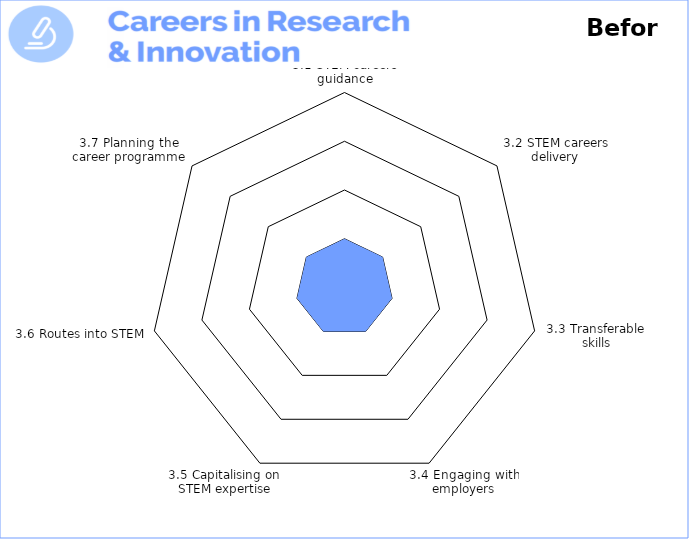
| Category | Theme 1: Leadership, Vision & Culture 

Before |
|---|---|
| 3.1 STEM careers guidance | 1 |
| 3.2 STEM careers delivery | 1 |
| 3.3 Transferable 
skills | 1 |
| 3.4 Engaging with employers | 1 |
| 3.5 Capitalising on STEM expertise | 1 |
| 3.6 Routes into STEM | 1 |
| 3.7 Planning the career programme | 1 |